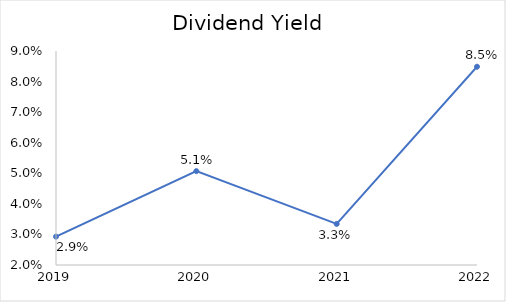
| Category | Dividend Yield |
|---|---|
| 2019.0 | 0.029 |
| 2020.0 | 0.051 |
| 2021.0 | 0.033 |
| 2022.0 | 0.085 |